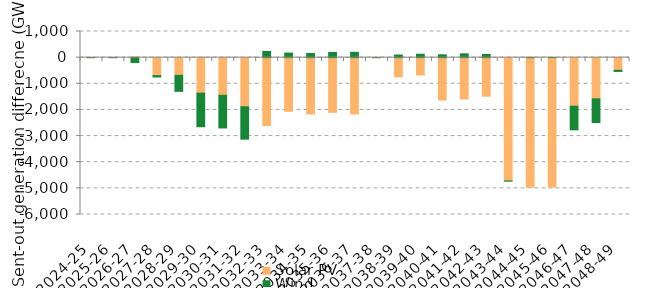
| Category | Solar PV | Wind | Offshore wind |
|---|---|---|---|
| 2024-25 | -1.248 | 0.292 | 0 |
| 2025-26 | -2.522 | 0.505 | 0 |
| 2026-27 | 33.253 | -188.266 | 0 |
| 2027-28 | -688.501 | -52.196 | 0 |
| 2028-29 | -676.04 | -613.069 | 0 |
| 2029-30 | -1357.986 | -1283.559 | 0 |
| 2030-31 | -1439.239 | -1250.292 | 0 |
| 2031-32 | -1878.145 | -1240.186 | 0 |
| 2032-33 | -2594.826 | 237.963 | 0 |
| 2033-34 | -2051.49 | 175.698 | 0 |
| 2034-35 | -2152.983 | 160.969 | 0 |
| 2035-36 | -2090.56 | 199.923 | 0 |
| 2036-37 | -2154.375 | 205.17 | 0 |
| 2037-38 | -1.214 | 0.833 | 0 |
| 2038-39 | -733.451 | 100.543 | 0 |
| 2039-40 | -662.831 | 130.086 | 0 |
| 2040-41 | -1620.745 | 109.401 | 0 |
| 2041-42 | -1579.436 | 144.999 | 0 |
| 2042-43 | -1475.111 | 123.243 | 0 |
| 2043-44 | -4714.013 | -8.468 | 0 |
| 2044-45 | -4956.275 | 3.903 | 0 |
| 2045-46 | -4950.78 | 4.096 | 0 |
| 2046-47 | -1857.01 | -904.366 | 0 |
| 2047-48 | -1575.154 | -907.009 | 0 |
| 2048-49 | -483.921 | -43.44 | 0 |